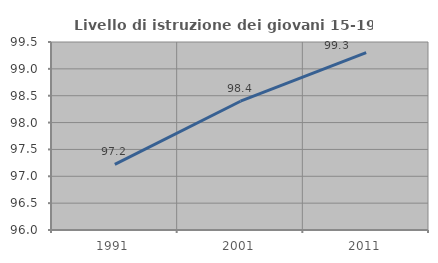
| Category | Livello di istruzione dei giovani 15-19 anni |
|---|---|
| 1991.0 | 97.222 |
| 2001.0 | 98.397 |
| 2011.0 | 99.301 |